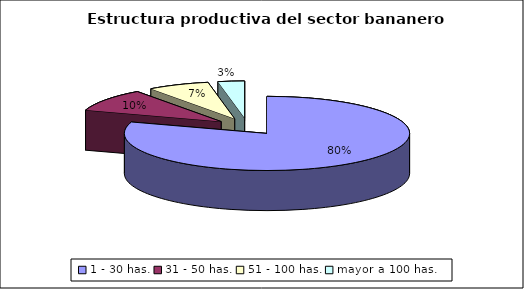
| Category | Series 0 |
|---|---|
| 1 - 30 has. | 0.8 |
| 31 - 50 has. | 0.1 |
| 51 - 100 has. | 0.07 |
| mayor a 100 has. | 0.03 |